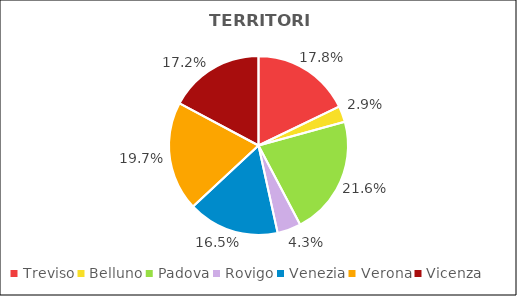
| Category | Series 0 |
|---|---|
| Treviso | 28714 |
| Belluno | 4634 |
| Padova | 34734 |
| Rovigo | 6882 |
| Venezia | 26576 |
| Verona | 31770 |
| Vicenza | 27682 |